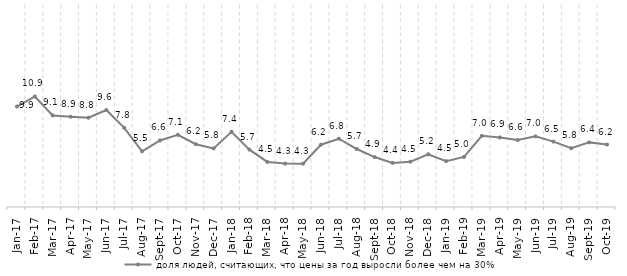
| Category | доля людей, считающих, что цены за год выросли более чем на 30% |
|---|---|
| 2017-01-01 | 9.946 |
| 2017-02-01 | 10.942 |
| 2017-03-01 | 9.066 |
| 2017-04-01 | 8.939 |
| 2017-05-01 | 8.844 |
| 2017-06-01 | 9.6 |
| 2017-07-01 | 7.841 |
| 2017-08-01 | 5.509 |
| 2017-09-01 | 6.587 |
| 2017-10-01 | 7.147 |
| 2017-11-01 | 6.218 |
| 2017-12-01 | 5.8 |
| 2018-01-01 | 7.445 |
| 2018-02-01 | 5.682 |
| 2018-03-01 | 4.463 |
| 2018-04-01 | 4.296 |
| 2018-05-01 | 4.287 |
| 2018-06-01 | 6.164 |
| 2018-07-01 | 6.758 |
| 2018-08-01 | 5.744 |
| 2018-09-01 | 4.946 |
| 2018-10-01 | 4.368 |
| 2018-11-01 | 4.491 |
| 2018-12-01 | 5.219 |
| 2019-01-01 | 4.543 |
| 2019-02-01 | 4.953 |
| 2019-03-01 | 7.044 |
| 2019-04-01 | 6.883 |
| 2019-05-01 | 6.627 |
| 2019-06-01 | 6.991 |
| 2019-07-01 | 6.476 |
| 2019-08-01 | 5.822 |
| 2019-09-01 | 6.397 |
| 2019-10-01 | 6.183 |